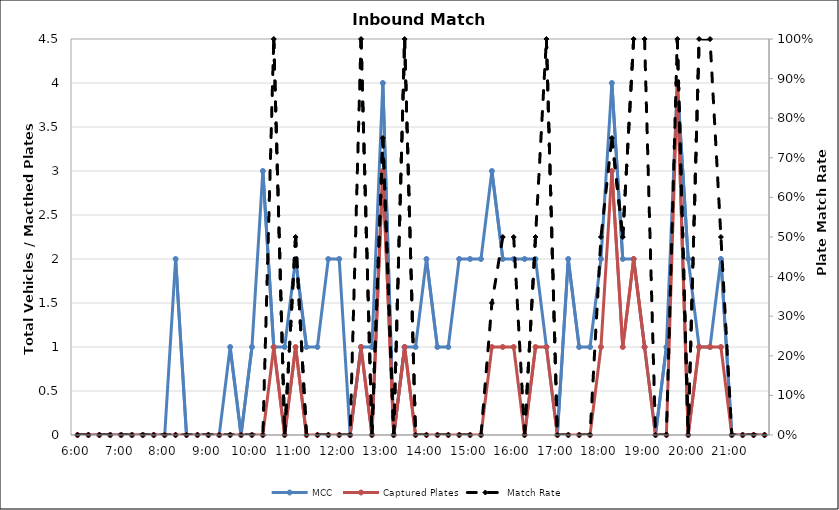
| Category | MCC | Captured Plates |
|---|---|---|
| 0.25 | 0 | 0 |
| 0.260416666666667 | 0 | 0 |
| 0.270833333333333 | 0 | 0 |
| 0.28125 | 0 | 0 |
| 0.291666666666667 | 0 | 0 |
| 0.302083333333333 | 0 | 0 |
| 0.3125 | 0 | 0 |
| 0.322916666666667 | 0 | 0 |
| 0.333333333333333 | 0 | 0 |
| 0.34375 | 2 | 0 |
| 0.354166666666667 | 0 | 0 |
| 0.364583333333333 | 0 | 0 |
| 0.375 | 0 | 0 |
| 0.385416666666667 | 0 | 0 |
| 0.395833333333333 | 1 | 0 |
| 0.40625 | 0 | 0 |
| 0.416666666666667 | 1 | 0 |
| 0.427083333333333 | 3 | 0 |
| 0.4375 | 1 | 1 |
| 0.447916666666667 | 1 | 0 |
| 0.458333333333333 | 2 | 1 |
| 0.46875 | 1 | 0 |
| 0.479166666666667 | 1 | 0 |
| 0.489583333333333 | 2 | 0 |
| 0.5 | 2 | 0 |
| 0.510416666666667 | 0 | 0 |
| 0.520833333333333 | 1 | 1 |
| 0.53125 | 1 | 0 |
| 0.541666666666667 | 4 | 3 |
| 0.552083333333333 | 0 | 0 |
| 0.5625 | 1 | 1 |
| 0.572916666666667 | 1 | 0 |
| 0.583333333333333 | 2 | 0 |
| 0.59375 | 1 | 0 |
| 0.604166666666667 | 1 | 0 |
| 0.614583333333333 | 2 | 0 |
| 0.625 | 2 | 0 |
| 0.635416666666667 | 2 | 0 |
| 0.645833333333333 | 3 | 1 |
| 0.65625 | 2 | 1 |
| 0.666666666666667 | 2 | 1 |
| 0.677083333333333 | 2 | 0 |
| 0.6875 | 2 | 1 |
| 0.697916666666667 | 1 | 1 |
| 0.708333333333333 | 0 | 0 |
| 0.71875 | 2 | 0 |
| 0.729166666666667 | 1 | 0 |
| 0.739583333333333 | 1 | 0 |
| 0.75 | 2 | 1 |
| 0.760416666666667 | 4 | 3 |
| 0.770833333333333 | 2 | 1 |
| 0.78125 | 2 | 2 |
| 0.791666666666667 | 1 | 1 |
| 0.802083333333333 | 0 | 0 |
| 0.8125 | 1 | 0 |
| 0.822916666666667 | 4 | 4 |
| 0.833333333333333 | 2 | 0 |
| 0.84375 | 1 | 1 |
| 0.854166666666667 | 1 | 1 |
| 0.864583333333333 | 2 | 1 |
| 0.875 | 0 | 0 |
| 0.885416666666667 | 0 | 0 |
| 0.895833333333333 | 0 | 0 |
| 0.90625 | 0 | 0 |